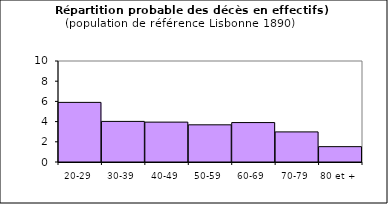
| Category | Series 0 |
|---|---|
| 20-29 | 5.903 |
| 30-39 | 4.021 |
| 40-49 | 3.948 |
| 50-59 | 3.682 |
| 60-69 | 3.904 |
| 70-79 | 2.98 |
| 80 et + | 1.52 |